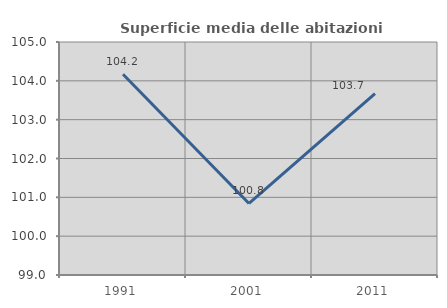
| Category | Superficie media delle abitazioni occupate |
|---|---|
| 1991.0 | 104.171 |
| 2001.0 | 100.843 |
| 2011.0 | 103.671 |